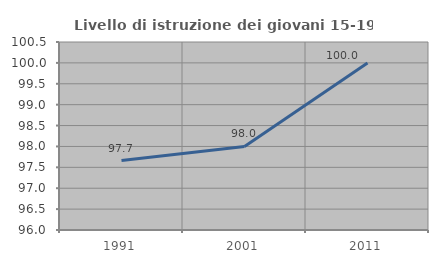
| Category | Livello di istruzione dei giovani 15-19 anni |
|---|---|
| 1991.0 | 97.664 |
| 2001.0 | 98 |
| 2011.0 | 100 |